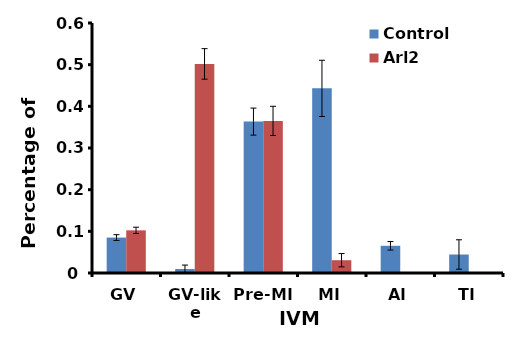
| Category | Control | Arl2 |
|---|---|---|
| GV | 0.085 | 0.102 |
| GV-like | 0.01 | 0.502 |
| Pre-MI | 0.363 | 0.365 |
| MI | 0.443 | 0.031 |
| AI | 0.065 | 0 |
| TI | 0.044 | 0 |